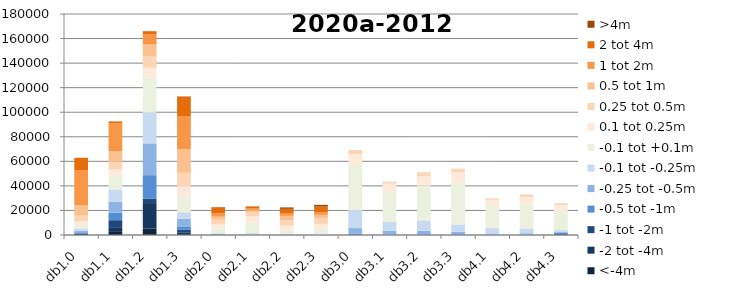
| Category | <-4m | -2 tot -4m | -1 tot -2m | -0.5 tot -1m | -0.25 tot -0.5m | -0.1 tot -0.25m | -0.1 tot +0.1m | 0.1 tot 0.25m | 0.25 tot 0.5m | 0.5 tot 1m | 1 tot 2m | 2 tot 4m | >4m |
|---|---|---|---|---|---|---|---|---|---|---|---|---|---|
| db1.0 | 0 | 0 | 907 | 1291 | 1260 | 1400 | 3341 | 3160 | 4497 | 8207 | 28834 | 10006 | 0 |
| db1.1 | 2521 | 3854 | 5690 | 6196 | 8836 | 9986 | 11598 | 4712 | 6330 | 8400 | 22991 | 1414 | 0 |
| db1.2 | 5324 | 20679 | 3505 | 19221 | 25874 | 25015 | 28709 | 7893 | 9098 | 9882 | 8444 | 2341 | 11 |
| db1.3 | 0 | 1803 | 2442 | 2740 | 6351 | 5219 | 13008 | 8221 | 10893 | 19205 | 26610 | 16137 | 240 |
| db2.0 | 0 | 0 | 109 | 382 | 337 | 584 | 3676 | 3926 | 3456 | 2462 | 2834 | 4793 | 203 |
| db2.1 | 0 | 0 | 1 | 144 | 388 | 971 | 8794 | 5022 | 3014 | 1962 | 1347 | 1677 | 21 |
| db2.2 | 0 | 0 | 79 | 173 | 175 | 326 | 2931 | 4031 | 4383 | 3500 | 1832 | 3892 | 1152 |
| db2.3 | 0 | 1 | 23 | 28 | 153 | 570 | 4487 | 3811 | 4597 | 2739 | 2220 | 4517 | 1405 |
| db3.0 | 33 | 154 | 214 | 515 | 4715 | 14783 | 36975 | 8644 | 2085 | 600 | 180 | 0 | 0 |
| db3.1 | 0 | 0 | 5 | 485 | 2900 | 7288 | 24444 | 6648 | 1529 | 126 | 0 | 0 | 0 |
| db3.2 | 0 | 0 | 11 | 532 | 2967 | 8439 | 28386 | 7544 | 2560 | 479 | 26 | 0 | 0 |
| db3.3 | 0 | 9 | 177 | 384 | 1972 | 6080 | 34043 | 8569 | 2333 | 315 | 38 | 0 | 0 |
| db4.1 | 0 | 0 | 30 | 82 | 1104 | 4409 | 18734 | 4336 | 1047 | 84 | 17 | 0 | 0 |
| db4.2 | 0 | 23 | 45 | 98 | 1208 | 3877 | 19653 | 6122 | 1703 | 190 | 27 | 0 | 0 |
| db4.3 | 2 | 84 | 611 | 1314 | 624 | 1395 | 16527 | 3985 | 951 | 250 | 67 | 0 | 0 |